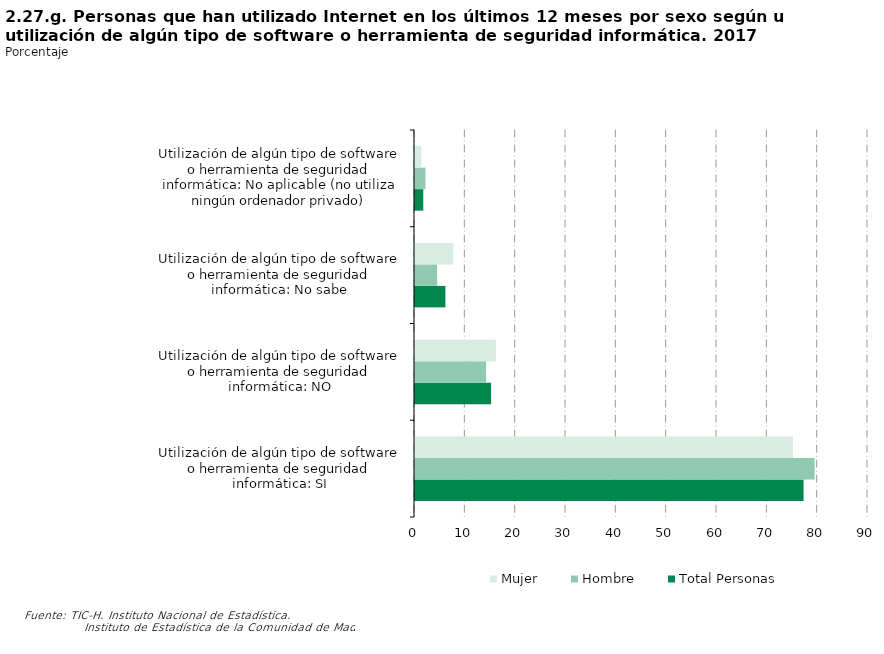
| Category | Total Personas | Hombre | Mujer |
|---|---|---|---|
| Utilización de algún tipo de software o herramienta de seguridad informática: SI | 77.195 | 79.395 | 75.076 |
| Utilización de algún tipo de software o herramienta de seguridad informática: NO | 15.115 | 14.13 | 16.063 |
| Utilización de algún tipo de software o herramienta de seguridad informática: No sabe | 6.043 | 4.398 | 7.628 |
| Utilización de algún tipo de software o herramienta de seguridad informática: No aplicable (no utiliza ningún ordenador privado) | 1.647 | 2.077 | 1.234 |